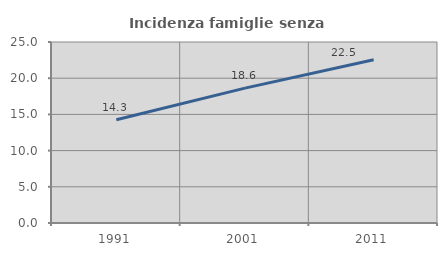
| Category | Incidenza famiglie senza nuclei |
|---|---|
| 1991.0 | 14.263 |
| 2001.0 | 18.63 |
| 2011.0 | 22.539 |